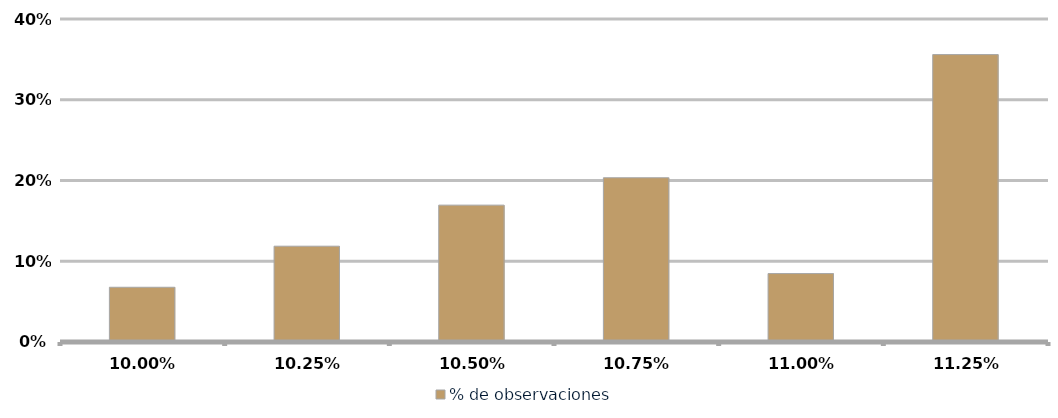
| Category | % de observaciones  |
|---|---|
| 0.09999999999999999 | 0.068 |
| 0.1025 | 0.119 |
| 0.105 | 0.169 |
| 0.1075 | 0.203 |
| 0.11 | 0.085 |
| 0.1125 | 0.356 |